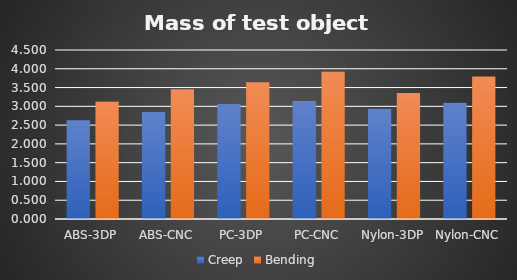
| Category | Creep | Bending |
|---|---|---|
| ABS-3DP | 2.631 | 3.128 |
| ABS-CNC | 2.851 | 3.453 |
| PC-3DP | 3.062 | 3.641 |
| PC-CNC | 3.144 | 3.926 |
| Nylon-3DP | 2.936 | 3.355 |
| Nylon-CNC | 3.096 | 3.797 |